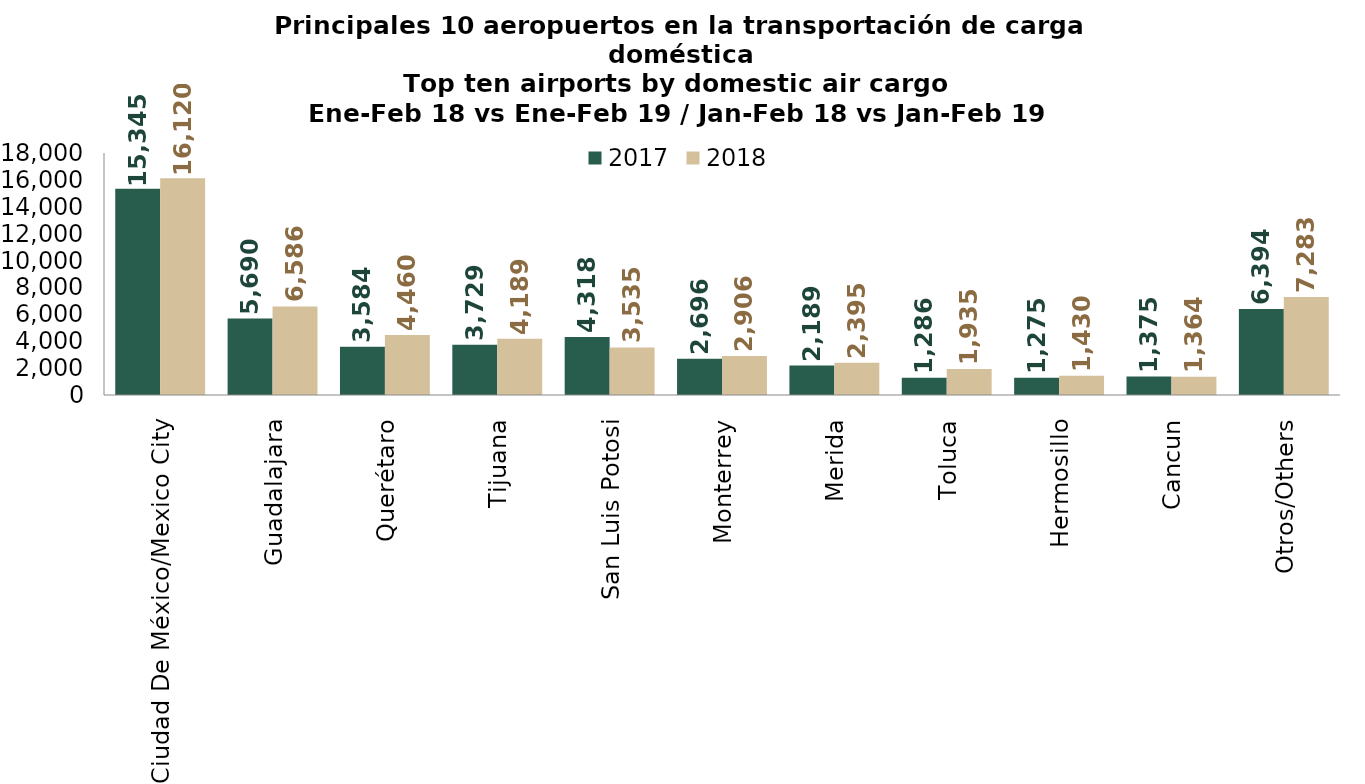
| Category | 2017 | 2018 |
|---|---|---|
| Ciudad De México/Mexico City | 15344.66 | 16120.27 |
| Guadalajara | 5689.595 | 6585.995 |
| Querétaro | 3584.347 | 4460.036 |
| Tijuana | 3729.023 | 4188.512 |
| San Luis Potosi | 4317.78 | 3534.594 |
| Monterrey | 2695.921 | 2905.526 |
| Merida | 2189.162 | 2394.821 |
| Toluca | 1285.617 | 1934.653 |
| Hermosillo | 1274.694 | 1430.461 |
| Cancun | 1375.076 | 1364.155 |
| Otros/Others | 6393.761 | 7282.557 |